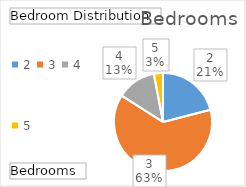
| Category | Total |
|---|---|
| 2 | 21 |
| 3 | 63 |
| 4 | 13 |
| 5 | 3 |